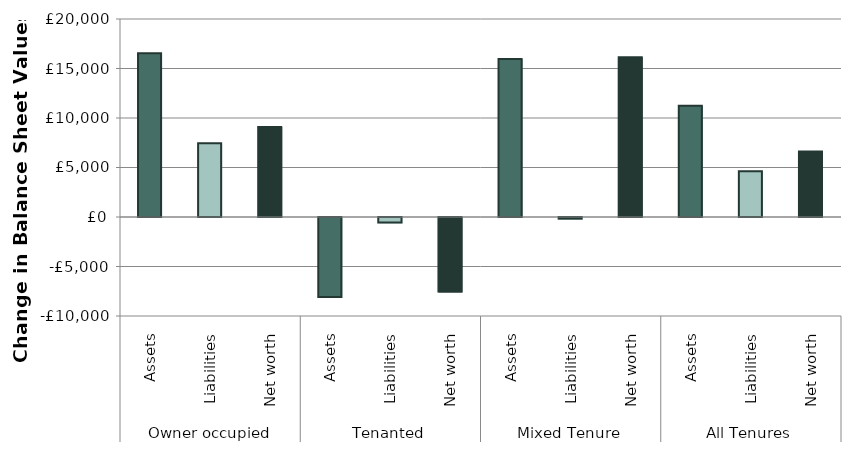
| Category | Series 0 |
|---|---|
| 0 | 16528 |
| 1 | 7444 |
| 2 | 9084 |
| 3 | -8086 |
| 4 | -548 |
| 5 | -7537 |
| 6 | 15962 |
| 7 | -164 |
| 8 | 16126 |
| 9 | 11242 |
| 10 | 4614 |
| 11 | 6628 |